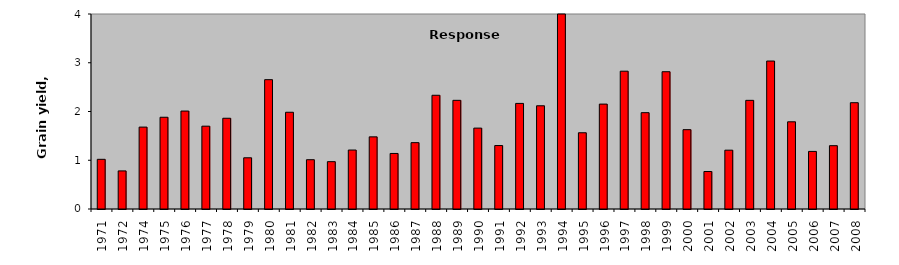
| Category | Series 1 |
|---|---|
| 1971.0 | 1.019 |
| 1972.0 | 0.781 |
| 1974.0 | 1.68 |
| 1975.0 | 1.882 |
| 1976.0 | 2.009 |
| 1977.0 | 1.699 |
| 1978.0 | 1.861 |
| 1979.0 | 1.051 |
| 1980.0 | 2.653 |
| 1981.0 | 1.985 |
| 1982.0 | 1.011 |
| 1983.0 | 0.971 |
| 1984.0 | 1.209 |
| 1985.0 | 1.48 |
| 1986.0 | 1.139 |
| 1987.0 | 1.361 |
| 1988.0 | 2.333 |
| 1989.0 | 2.229 |
| 1990.0 | 1.659 |
| 1991.0 | 1.302 |
| 1992.0 | 2.166 |
| 1993.0 | 2.117 |
| 1994.0 | 4.085 |
| 1995.0 | 1.564 |
| 1996.0 | 2.152 |
| 1997.0 | 2.827 |
| 1998.0 | 1.976 |
| 1999.0 | 2.816 |
| 2000.0 | 1.628 |
| 2001.0 | 0.769 |
| 2002.0 | 1.207 |
| 2003.0 | 2.229 |
| 2004.0 | 3.035 |
| 2005.0 | 1.789 |
| 2006.0 | 1.181 |
| 2007.0 | 1.299 |
| 2008.0 | 2.181 |